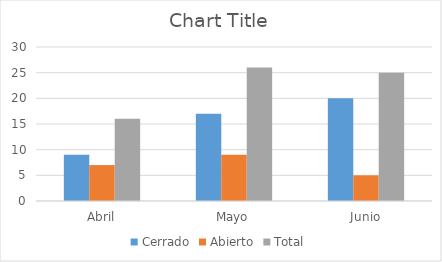
| Category | Cerrado | Abierto | Total |
|---|---|---|---|
| Abril | 9 | 7 | 16 |
| Mayo | 17 | 9 | 26 |
| Junio | 20 | 5 | 25 |